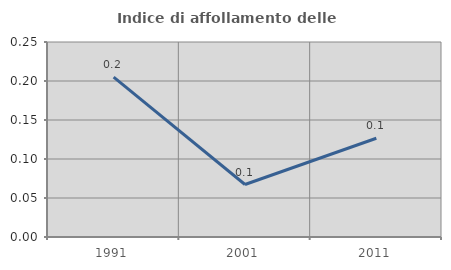
| Category | Indice di affollamento delle abitazioni  |
|---|---|
| 1991.0 | 0.205 |
| 2001.0 | 0.067 |
| 2011.0 | 0.127 |